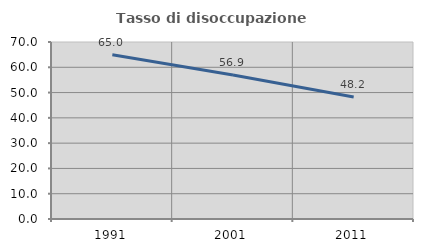
| Category | Tasso di disoccupazione giovanile  |
|---|---|
| 1991.0 | 64.978 |
| 2001.0 | 56.934 |
| 2011.0 | 48.241 |